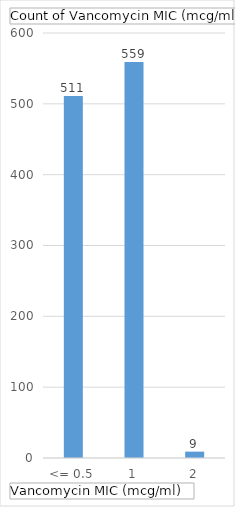
| Category | Total |
|---|---|
| <= 0.5 | 511 |
| 1 | 559 |
| 2 | 9 |